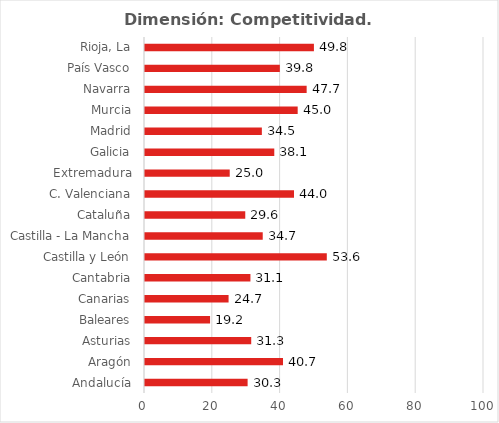
| Category | Dimensión: Competitividad |
|---|---|
| Andalucía | 30.27 |
| Aragón | 40.709 |
| Asturias | 31.332 |
| Baleares | 19.195 |
| Canarias | 24.655 |
| Cantabria | 31.099 |
| Castilla y León | 53.629 |
| Castilla - La Mancha | 34.73 |
| Cataluña | 29.576 |
| C. Valenciana | 43.954 |
| Extremadura | 24.994 |
| Galicia | 38.137 |
| Madrid | 34.471 |
| Murcia | 45.04 |
| Navarra | 47.687 |
| País Vasco | 39.777 |
| Rioja, La | 49.831 |